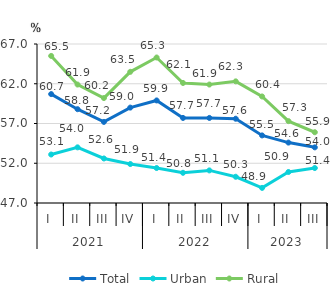
| Category | Total | Urban | Rural |
|---|---|---|---|
| 0 | 60.7 | 53.1 | 65.5 |
| 1 | 58.8 | 54 | 61.9 |
| 2 | 57.2 | 52.6 | 60.2 |
| 3 | 59 | 51.9 | 63.5 |
| 4 | 59.9 | 51.4 | 65.3 |
| 5 | 57.7 | 50.8 | 62.1 |
| 6 | 57.7 | 51.1 | 61.9 |
| 7 | 57.6 | 50.3 | 62.3 |
| 8 | 55.5 | 48.9 | 60.4 |
| 9 | 54.6 | 50.9 | 57.3 |
| 10 | 54 | 51.4 | 55.9 |